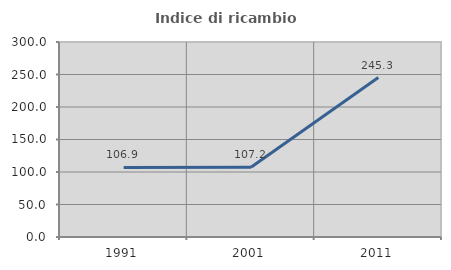
| Category | Indice di ricambio occupazionale  |
|---|---|
| 1991.0 | 106.936 |
| 2001.0 | 107.238 |
| 2011.0 | 245.26 |